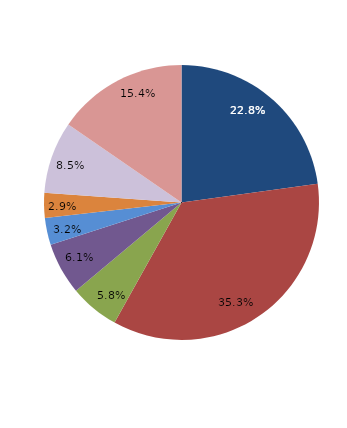
| Category | Series 0 |
|---|---|
| قبل الدخول | 22.812 |
| -1 | 35.279 |
| 1 | 5.836 |
| 2 | 6.101 |
| 3 | 3.183 |
| 4 | 2.918 |
|  5 - 9 | 8.488 |
| 10 - 14 | 15.385 |